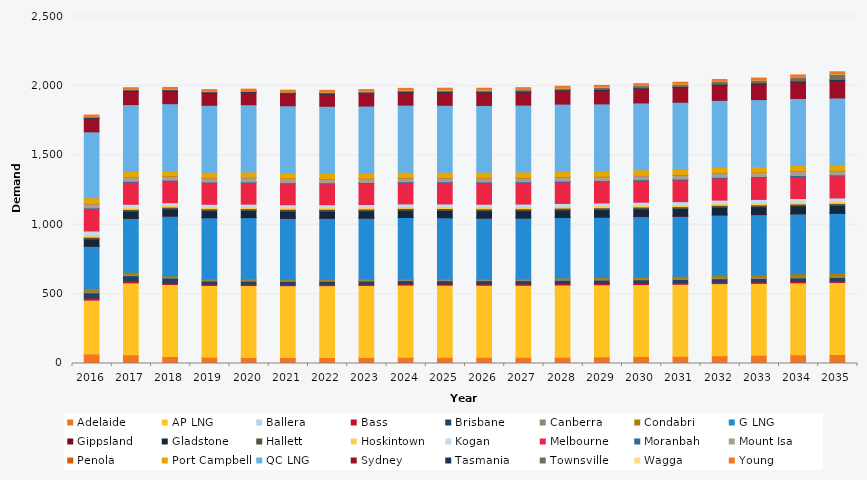
| Category | Adelaide | AP LNG | Ballera | Bass | Brisbane | Canberra | Condabri | G LNG | Gippsland | Gladstone | Hallett | Hoskintown | Kogan | Melbourne | Moranbah | Mount Isa | Penola | Port Campbell | QC LNG | Sydney | Tasmania | Townsville | Wagga | Young |
|---|---|---|---|---|---|---|---|---|---|---|---|---|---|---|---|---|---|---|---|---|---|---|---|---|
| 2016.0 | 68.053 | 388.69 | 0.023 | 15.538 | 36.808 | 8.587 | 22.47 | 305.178 | 0.665 | 50.539 | 13.818 | 15.878 | 28.516 | 159.846 | 6.43 | 29.515 | 2.632 | 41.736 | 474.034 | 95.944 | 6.691 | 6.437 | 0.209 | 12.073 |
| 2017.0 | 63.061 | 517.774 | 0.028 | 15.524 | 36.367 | 8.631 | 15.429 | 389.235 | 0.633 | 50.094 | 13.793 | 14.216 | 22.226 | 158.98 | 6.358 | 28.261 | 2.564 | 39.627 | 482.502 | 96.291 | 6.768 | 6.515 | 0.106 | 12.117 |
| 2018.0 | 51.278 | 517.774 | 0.048 | 10.003 | 36.066 | 8.622 | 7.21 | 431.486 | 0.615 | 49.687 | 13.767 | 14.074 | 17.914 | 155.782 | 6.291 | 28.131 | 2.55 | 38.045 | 482.502 | 91.322 | 6.786 | 6.75 | 0.167 | 12.111 |
| 2019.0 | 44.484 | 517.774 | 0.032 | 9.952 | 22.081 | 8.578 | 7.374 | 440.174 | 0.644 | 50.219 | 13.673 | 13.62 | 18.365 | 154.6 | 6.25 | 28.083 | 2.487 | 39.459 | 482.502 | 87.379 | 6.844 | 6.56 | 0.115 | 12.081 |
| 2020.0 | 42.495 | 519.159 | 0.023 | 9.959 | 22.096 | 8.487 | 7.561 | 441.353 | 0.641 | 50.369 | 13.629 | 13.93 | 18.282 | 153.624 | 6.419 | 30.893 | 2.459 | 39.076 | 483.793 | 87.045 | 6.895 | 6.362 | 0.082 | 12.025 |
| 2021.0 | 42.419 | 517.792 | 0.038 | 9.903 | 22.023 | 8.375 | 7.509 | 438.63 | 0.668 | 50.429 | 13.597 | 13.768 | 18.535 | 152.142 | 6.569 | 30.387 | 2.456 | 39.193 | 482.474 | 86.555 | 6.939 | 6.964 | 0.117 | 11.935 |
| 2022.0 | 43.07 | 517.822 | 0.043 | 9.821 | 21.843 | 8.319 | 7.387 | 438.63 | 0.643 | 50.262 | 13.468 | 14.341 | 18.289 | 151.009 | 6.68 | 27.517 | 2.432 | 39.214 | 482.43 | 86.76 | 6.977 | 8.643 | 0.471 | 11.865 |
| 2023.0 | 44.097 | 517.851 | 0.055 | 9.876 | 22.019 | 8.347 | 7.521 | 438.279 | 0.795 | 50.487 | 13.535 | 13.936 | 18.785 | 151.617 | 6.694 | 27.672 | 2.469 | 38.657 | 482.386 | 88.551 | 7.01 | 9.702 | 1.261 | 11.906 |
| 2024.0 | 45.237 | 519.267 | 0.075 | 9.962 | 22.299 | 8.428 | 7.237 | 439.452 | 0.97 | 50.759 | 13.618 | 13.988 | 18.52 | 152.534 | 6.715 | 27.367 | 2.498 | 38.885 | 483.633 | 89.96 | 7.038 | 10.246 | 1.683 | 11.999 |
| 2025.0 | 45.834 | 517.911 | 0.077 | 10.053 | 22.586 | 8.506 | 7.663 | 437.571 | 1.233 | 51.049 | 13.739 | 13.867 | 19.343 | 153.225 | 6.737 | 27.579 | 2.502 | 38.756 | 482.298 | 91.098 | 7.061 | 10.788 | 1.971 | 12.087 |
| 2026.0 | 45.379 | 517.94 | 0.08 | 10.122 | 22.856 | 8.584 | 7.425 | 435.47 | 1.325 | 51.305 | 13.726 | 13.931 | 19.32 | 153.479 | 6.756 | 27.768 | 2.537 | 39.064 | 482.255 | 91.704 | 7.079 | 11.099 | 1.943 | 12.173 |
| 2027.0 | 45.398 | 517.97 | 0.085 | 10.186 | 23.144 | 8.658 | 7.51 | 435.47 | 1.241 | 51.578 | 13.716 | 14.162 | 19.356 | 153.584 | 6.778 | 27.984 | 2.533 | 40.131 | 482.211 | 92.776 | 7.092 | 11.814 | 1.729 | 12.256 |
| 2028.0 | 45.913 | 519.385 | 0.08 | 10.259 | 23.435 | 8.735 | 7.97 | 436.636 | 1.568 | 51.879 | 13.683 | 13.973 | 19.533 | 153.79 | 6.801 | 28.196 | 2.522 | 41.02 | 483.457 | 95.07 | 7.1 | 12.779 | 1.417 | 12.343 |
| 2029.0 | 48.643 | 518.029 | 0.117 | 10.339 | 23.733 | 8.82 | 9.247 | 435.47 | 2.083 | 52.174 | 13.693 | 14.29 | 19.702 | 154.562 | 6.826 | 28.398 | 2.537 | 39.442 | 482.123 | 97.823 | 7.106 | 14.616 | 1.66 | 12.435 |
| 2030.0 | 50.574 | 518.058 | 0.156 | 10.432 | 24.038 | 8.911 | 11.535 | 434.501 | 3.091 | 52.5 | 13.704 | 13.83 | 20.81 | 155.06 | 6.852 | 28.608 | 2.458 | 40.037 | 482.079 | 101.456 | 7.109 | 16.369 | 1.417 | 12.533 |
| 2031.0 | 52.727 | 518.088 | 0.196 | 10.527 | 24.344 | 9.004 | 13.773 | 431.623 | 3.208 | 52.823 | 13.689 | 13.984 | 21.9 | 155.932 | 6.878 | 28.82 | 2.427 | 40.34 | 482.035 | 105.434 | 7.111 | 17.834 | 1.351 | 12.632 |
| 2032.0 | 55.824 | 519.504 | 0.239 | 10.614 | 24.655 | 9.096 | 16.312 | 432.778 | 3.901 | 53.139 | 13.769 | 14.024 | 23.37 | 157.117 | 6.905 | 29.036 | 2.452 | 39.778 | 483.281 | 109.476 | 7.113 | 19.412 | 1.422 | 12.731 |
| 2033.0 | 58.676 | 518.147 | 0.286 | 10.697 | 24.967 | 9.187 | 18.78 | 431.623 | 3.677 | 53.467 | 13.74 | 14.101 | 24.79 | 157.62 | 6.933 | 29.254 | 2.441 | 41.038 | 481.947 | 112.735 | 7.114 | 20.906 | 1.618 | 12.827 |
| 2034.0 | 62.2 | 518.177 | 0.272 | 10.786 | 25.288 | 9.279 | 19.422 | 431.623 | 4.421 | 53.81 | 13.767 | 14.292 | 25.353 | 158.766 | 6.977 | 29.484 | 2.46 | 40.729 | 481.903 | 118.961 | 7.114 | 29.117 | 1.847 | 12.927 |
| 2035.0 | 65.552 | 518.206 | 0.217 | 10.873 | 25.611 | 9.372 | 19.621 | 431.623 | 4.611 | 54.175 | 13.777 | 15.469 | 23.606 | 159.37 | 7.023 | 29.715 | 2.449 | 40.332 | 481.453 | 125.588 | 7.113 | 39.742 | 3.262 | 13.026 |